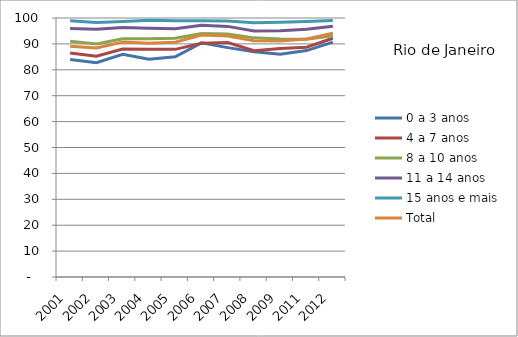
| Category | 0 a 3 anos | 4 a 7 anos | 8 a 10 anos | 11 a 14 anos | 15 anos e mais | Total |
|---|---|---|---|---|---|---|
| 2001.0 | 83.95 | 86.45 | 91.05 | 95.94 | 98.97 | 89.08 |
| 2002.0 | 82.74 | 85.22 | 89.95 | 95.65 | 98.24 | 88.4 |
| 2003.0 | 85.95 | 88 | 91.95 | 96.33 | 98.64 | 90.71 |
| 2004.0 | 84.05 | 87.93 | 92.01 | 96.08 | 99.09 | 90.23 |
| 2005.0 | 85.02 | 87.9 | 92.19 | 95.88 | 98.9 | 90.66 |
| 2006.0 | 90.39 | 90.26 | 93.97 | 97.19 | 98.93 | 93.45 |
| 2007.0 | 88.57 | 90.54 | 93.8 | 96.76 | 98.84 | 93.03 |
| 2008.0 | 86.94 | 87.38 | 92.33 | 95.02 | 98.2 | 91.23 |
| 2009.0 | 86 | 88.24 | 91.89 | 95.08 | 98.32 | 91.15 |
| 2011.0 | 87.41 | 88.7 | 91.77 | 95.7 | 98.66 | 91.92 |
| 2012.0 | 90.69 | 92.18 | 93.17 | 96.8 | 99.02 | 94.08 |